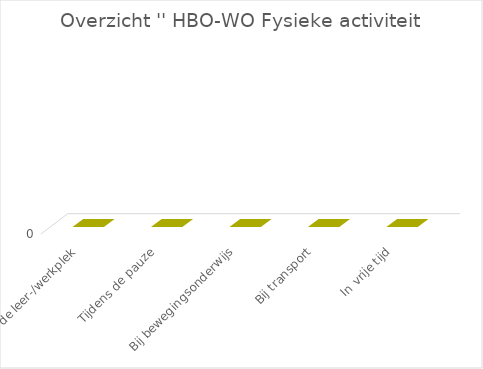
| Category | Series 2 |
|---|---|
| Op de leer-/werkplek | 0 |
| Tijdens de pauze | 0 |
| Bij bewegingsonderwijs | 0 |
| Bij transport | 0 |
| In vrije tijd | 0 |